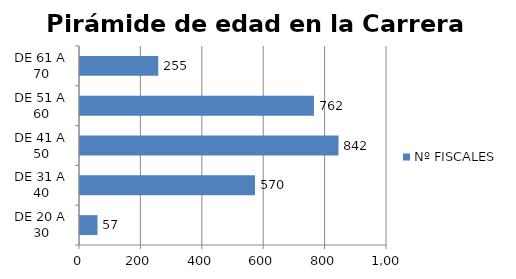
| Category | Nº FISCALES |
|---|---|
| DE 20 A 30 | 57 |
| DE 31 A 40 | 570 |
| DE 41 A 50 | 842 |
| DE 51 A 60 | 762 |
| DE 61 A 70 | 255 |